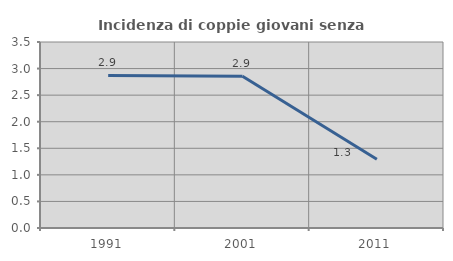
| Category | Incidenza di coppie giovani senza figli |
|---|---|
| 1991.0 | 2.871 |
| 2001.0 | 2.857 |
| 2011.0 | 1.294 |